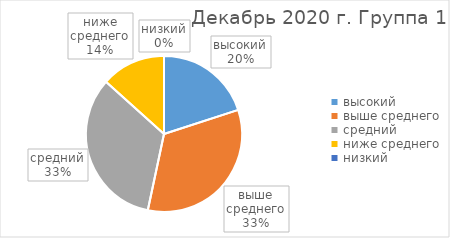
| Category | Series 0 |
|---|---|
| высокий | 3 |
| выше среднего | 5 |
| средний | 5 |
| ниже среднего | 2 |
| низкий | 0 |